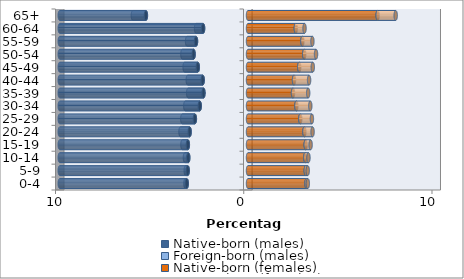
| Category | Native-born (males) | Foreign-born (males) | Native-born (females) | Foreign-born (females) |
|---|---|---|---|---|
| 0-4 | -3.253 | -0.071 | 3.105 | 0.073 |
| 5-9 | -3.202 | -0.105 | 3.069 | 0.104 |
| 10-14 | -3.173 | -0.177 | 3.043 | 0.169 |
| 15-19 | -3.195 | -0.288 | 3.064 | 0.262 |
| 20-24 | -3.1 | -0.486 | 2.996 | 0.434 |
| 25-29 | -2.822 | -0.669 | 2.779 | 0.616 |
| 30-34 | -2.563 | -0.768 | 2.571 | 0.738 |
| 35-39 | -2.366 | -0.812 | 2.391 | 0.806 |
| 40-44 | -2.406 | -0.793 | 2.445 | 0.8 |
| 45-49 | -2.666 | -0.701 | 2.721 | 0.72 |
| 50-54 | -2.89 | -0.594 | 2.986 | 0.628 |
| 55-59 | -2.762 | -0.474 | 2.889 | 0.533 |
| 60-64 | -2.385 | -0.372 | 2.54 | 0.463 |
| 65+ | -5.423 | -0.691 | 6.888 | 0.958 |